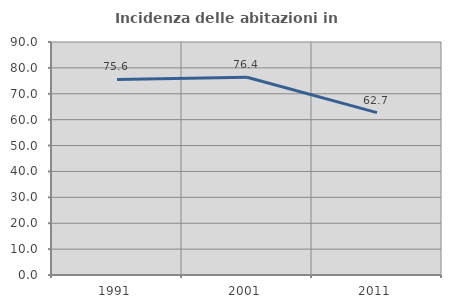
| Category | Incidenza delle abitazioni in proprietà  |
|---|---|
| 1991.0 | 75.556 |
| 2001.0 | 76.407 |
| 2011.0 | 62.74 |